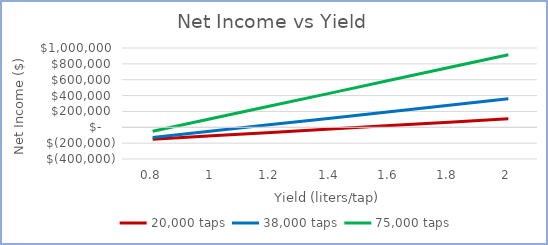
| Category | 20,000 taps | 38,000 taps | 75,000 taps |
|---|---|---|---|
| 0.8 | -151000 | -129000 | -50000 |
| 1.0 | -108000 | -47000 | 110000 |
| 1.2 | -65000 | 34000 | 271000 |
| 1.4 | -22000 | 115000 | 431000 |
| 1.6 | 21000 | 197000 | 593000 |
| 1.8 | 64000 | 278000 | 753000 |
| 2.0 | 107000 | 360000 | 914000 |